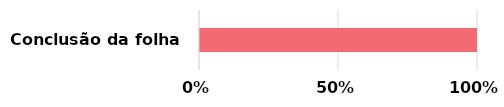
| Category | Series 0 | Series 1 |
|---|---|---|
| Conclusão da folha | 0 | 1 |